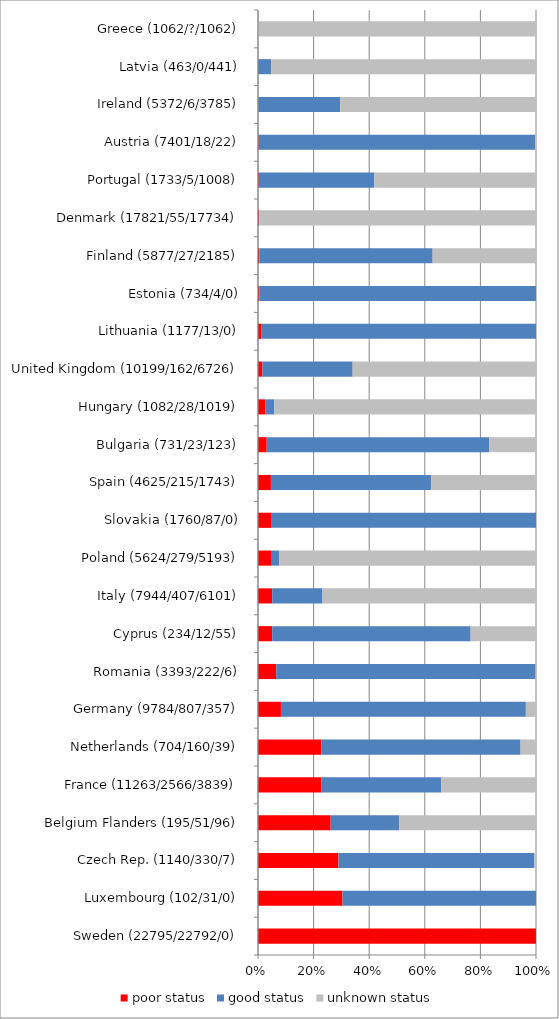
| Category | poor status | good status | unknown status |
|---|---|---|---|
| Sweden (22795/22792/0) | 22792 | 3 | 0 |
| Luxembourg (102/31/0) | 31 | 71 | 0 |
| Czech Rep. (1140/330/7) | 330 | 803 | 7 |
| Belgium Flanders (195/51/96) | 51 | 48 | 96 |
| France (11263/2566/3839) | 2566 | 4858 | 3839 |
| Netherlands (704/160/39) | 160 | 503 | 39 |
| Germany (9784/807/357) | 807 | 8620 | 357 |
| Romania (3393/222/6) | 222 | 3165 | 6 |
| Cyprus (234/12/55) | 12 | 167 | 55 |
| Italy (7944/407/6101) | 407 | 1436 | 6101 |
| Poland (5624/279/5193) | 279 | 152 | 5193 |
| Slovakia (1760/87/0) | 87 | 1673 | 0 |
| Spain (4625/215/1743) | 215 | 2667 | 1743 |
| Bulgaria (731/23/123) | 23 | 585 | 123 |
| Hungary (1082/28/1019) | 28 | 35 | 1019 |
| United Kingdom (10199/162/6726) | 162 | 3311 | 6726 |
| Lithuania (1177/13/0) | 13 | 1164 | 0 |
| Estonia (734/4/0) | 4 | 730 | 0 |
| Finland (5877/27/2185) | 27 | 3665 | 2185 |
| Denmark (17821/55/17734) | 55 | 32 | 17734 |
| Portugal (1733/5/1008) | 5 | 720 | 1008 |
| Austria (7401/18/22) | 18 | 7361 | 22 |
| Ireland (5372/6/3785) | 6 | 1581 | 3785 |
| Latvia (463/0/441) | 0 | 22 | 441 |
| Greece (1062/?/1062) | 0 | 0 | 1062 |